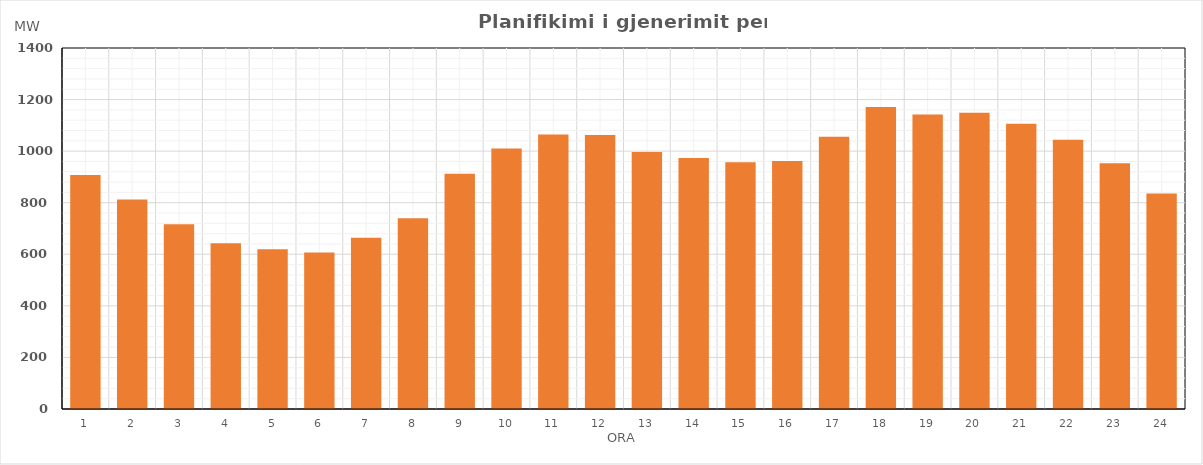
| Category | Max (MW) |
|---|---|
| 0 | 907.278 |
| 1 | 812.655 |
| 2 | 716.144 |
| 3 | 642.818 |
| 4 | 619.871 |
| 5 | 606.89 |
| 6 | 663.979 |
| 7 | 740.101 |
| 8 | 912.379 |
| 9 | 1010.019 |
| 10 | 1064.918 |
| 11 | 1062.744 |
| 12 | 996.893 |
| 13 | 973 |
| 14 | 957.242 |
| 15 | 961.832 |
| 16 | 1055.881 |
| 17 | 1171.239 |
| 18 | 1142.016 |
| 19 | 1149.02 |
| 20 | 1105.785 |
| 21 | 1043.874 |
| 22 | 953.025 |
| 23 | 835.632 |